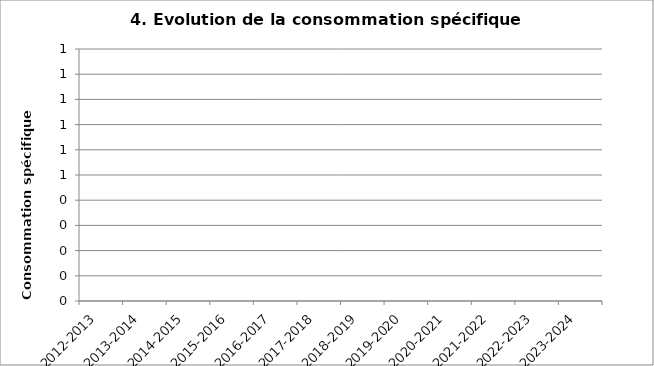
| Category | Consommation spécifique |
|---|---|
| 2012-2013 | 0 |
| 2013-2014 | 0 |
| 2014-2015 | 0 |
| 2015-2016 | 0 |
| 2016-2017 | 0 |
| 2017-2018 | 0 |
| 2018-2019 | 0 |
| 2019-2020 | 0 |
| 2020-2021 | 0 |
| 2021-2022 | 0 |
| 2022-2023 | 0 |
| 2023-2024 | 0 |